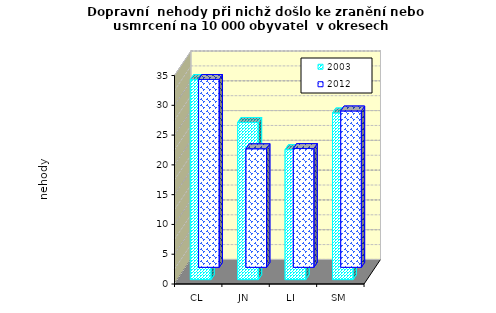
| Category | 2003 | 2012 |
|---|---|---|
| CL | 33.587 | 31.545 |
| JN | 26.389 | 19.906 |
| LI | 21.817 | 19.943 |
| SM | 27.98 | 26.253 |